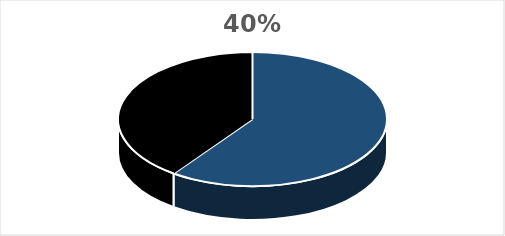
| Category | Series 0 |
|---|---|
| 0 | 0.599 |
| 1 | 0.401 |